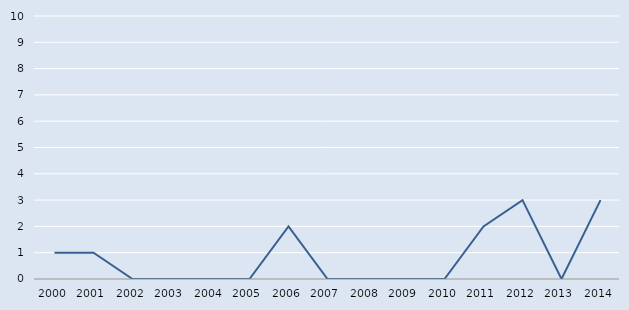
| Category | Series 0 |
|---|---|
| 2000.0 | 1 |
| 2001.0 | 1 |
| 2002.0 | 0 |
| 2003.0 | 0 |
| 2004.0 | 0 |
| 2005.0 | 0 |
| 2006.0 | 2 |
| 2007.0 | 0 |
| 2008.0 | 0 |
| 2009.0 | 0 |
| 2010.0 | 0 |
| 2011.0 | 2 |
| 2012.0 | 3 |
| 2013.0 | 0 |
| 2014.0 | 3 |